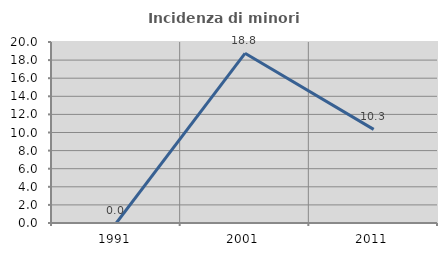
| Category | Incidenza di minori stranieri |
|---|---|
| 1991.0 | 0 |
| 2001.0 | 18.75 |
| 2011.0 | 10.345 |